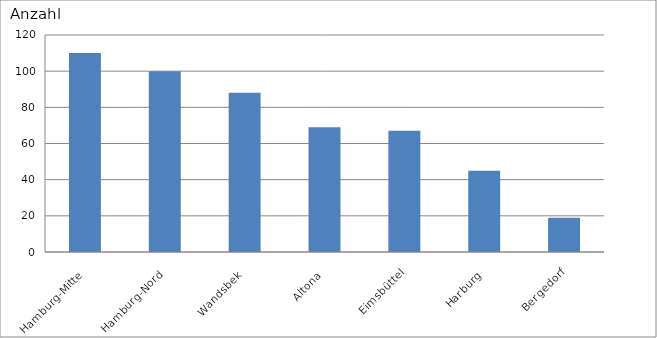
| Category | Hamburg-Mitte Hamburg-Nord Wandsbek Altona Eimsbüttel Harburg Bergedorf |
|---|---|
| Hamburg-Mitte | 110 |
| Hamburg-Nord | 100 |
| Wandsbek | 88 |
| Altona | 69 |
| Eimsbüttel | 67 |
| Harburg | 45 |
| Bergedorf | 19 |